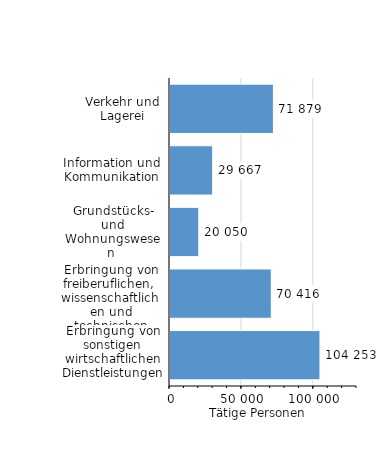
| Category | Tätige Personen |
|---|---|
| Verkehr und Lagerei | 71879 |
| Information und Kommunikation | 29667 |
| Grundstücks- und Wohnungswesen  | 20050 |
| Erbringung von freiberuflichen, 
wissenschaftlichen und technischen Dienstleistungen | 70416 |
| Erbringung von sonstigen wirtschaftlichen Dienstleistungen | 104253 |